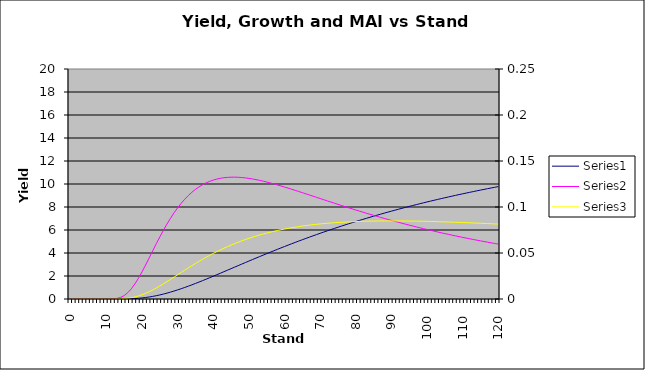
| Category | Series 0 |
|---|---|
| 0.0 | 0 |
| 1.0 | 0 |
| 2.0 | 0 |
| 3.0 | 0 |
| 4.0 | 0 |
| 5.0 | 0 |
| 6.0 | 0 |
| 7.0 | 0 |
| 8.0 | 0 |
| 9.0 | 0 |
| 10.0 | 0 |
| 11.0 | 0 |
| 12.0 | 0 |
| 13.0 | 0.001 |
| 14.0 | 0.003 |
| 15.0 | 0.006 |
| 16.0 | 0.013 |
| 17.0 | 0.024 |
| 18.0 | 0.041 |
| 19.0 | 0.063 |
| 20.0 | 0.093 |
| 21.0 | 0.13 |
| 22.0 | 0.174 |
| 23.0 | 0.227 |
| 24.0 | 0.287 |
| 25.0 | 0.354 |
| 26.0 | 0.429 |
| 27.0 | 0.51 |
| 28.0 | 0.598 |
| 29.0 | 0.692 |
| 30.0 | 0.791 |
| 31.0 | 0.895 |
| 32.0 | 1.003 |
| 33.0 | 1.116 |
| 34.0 | 1.232 |
| 35.0 | 1.351 |
| 36.0 | 1.473 |
| 37.0 | 1.597 |
| 38.0 | 1.723 |
| 39.0 | 1.851 |
| 40.0 | 1.98 |
| 41.0 | 2.111 |
| 42.0 | 2.242 |
| 43.0 | 2.374 |
| 44.0 | 2.506 |
| 45.0 | 2.638 |
| 46.0 | 2.771 |
| 47.0 | 2.903 |
| 48.0 | 3.035 |
| 49.0 | 3.167 |
| 50.0 | 3.298 |
| 51.0 | 3.428 |
| 52.0 | 3.558 |
| 53.0 | 3.687 |
| 54.0 | 3.815 |
| 55.0 | 3.942 |
| 56.0 | 4.068 |
| 57.0 | 4.193 |
| 58.0 | 4.318 |
| 59.0 | 4.44 |
| 60.0 | 4.562 |
| 61.0 | 4.683 |
| 62.0 | 4.802 |
| 63.0 | 4.92 |
| 64.0 | 5.037 |
| 65.0 | 5.152 |
| 66.0 | 5.267 |
| 67.0 | 5.38 |
| 68.0 | 5.492 |
| 69.0 | 5.602 |
| 70.0 | 5.711 |
| 71.0 | 5.819 |
| 72.0 | 5.926 |
| 73.0 | 6.031 |
| 74.0 | 6.135 |
| 75.0 | 6.238 |
| 76.0 | 6.34 |
| 77.0 | 6.44 |
| 78.0 | 6.539 |
| 79.0 | 6.637 |
| 80.0 | 6.734 |
| 81.0 | 6.83 |
| 82.0 | 6.924 |
| 83.0 | 7.017 |
| 84.0 | 7.109 |
| 85.0 | 7.2 |
| 86.0 | 7.29 |
| 87.0 | 7.379 |
| 88.0 | 7.466 |
| 89.0 | 7.553 |
| 90.0 | 7.638 |
| 91.0 | 7.723 |
| 92.0 | 7.806 |
| 93.0 | 7.888 |
| 94.0 | 7.97 |
| 95.0 | 8.05 |
| 96.0 | 8.129 |
| 97.0 | 8.208 |
| 98.0 | 8.285 |
| 99.0 | 8.362 |
| 100.0 | 8.437 |
| 101.0 | 8.512 |
| 102.0 | 8.585 |
| 103.0 | 8.658 |
| 104.0 | 8.73 |
| 105.0 | 8.801 |
| 106.0 | 8.872 |
| 107.0 | 8.941 |
| 108.0 | 9.01 |
| 109.0 | 9.078 |
| 110.0 | 9.145 |
| 111.0 | 9.211 |
| 112.0 | 9.276 |
| 113.0 | 9.341 |
| 114.0 | 9.405 |
| 115.0 | 9.468 |
| 116.0 | 9.531 |
| 117.0 | 9.592 |
| 118.0 | 9.653 |
| 119.0 | 9.714 |
| 120.0 | 9.773 |